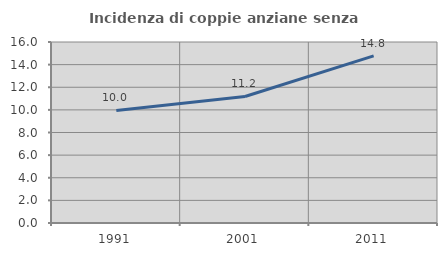
| Category | Incidenza di coppie anziane senza figli  |
|---|---|
| 1991.0 | 9.952 |
| 2001.0 | 11.185 |
| 2011.0 | 14.77 |